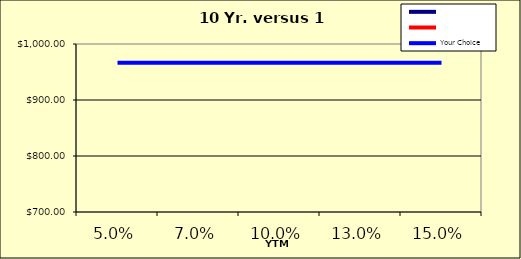
| Category | Series 0 | Series 1 | Your Choice |
|---|---|---|---|
| 0.05 |  |  | 966.653 |
| 0.07 |  |  | 966.653 |
| 0.1 |  |  | 966.653 |
| 0.13 |  |  | 966.653 |
| 0.15 |  |  | 966.653 |